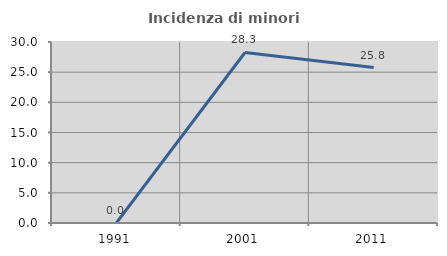
| Category | Incidenza di minori stranieri |
|---|---|
| 1991.0 | 0 |
| 2001.0 | 28.261 |
| 2011.0 | 25.758 |